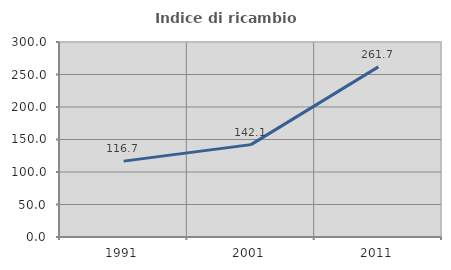
| Category | Indice di ricambio occupazionale  |
|---|---|
| 1991.0 | 116.712 |
| 2001.0 | 142.133 |
| 2011.0 | 261.724 |